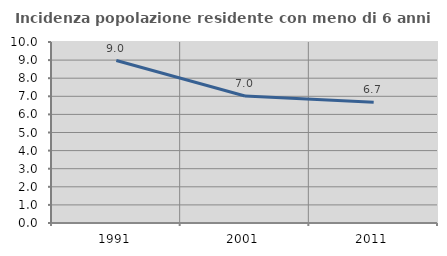
| Category | Incidenza popolazione residente con meno di 6 anni |
|---|---|
| 1991.0 | 8.975 |
| 2001.0 | 7.015 |
| 2011.0 | 6.669 |